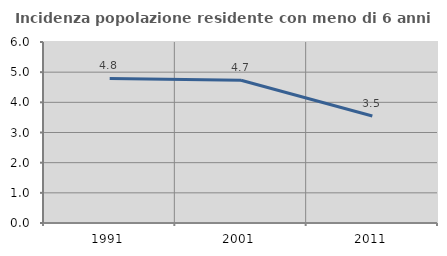
| Category | Incidenza popolazione residente con meno di 6 anni |
|---|---|
| 1991.0 | 4.794 |
| 2001.0 | 4.73 |
| 2011.0 | 3.547 |